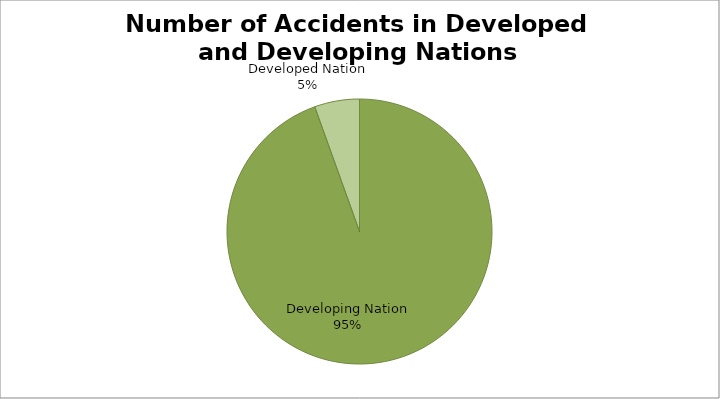
| Category | Number of Accidents |
|---|---|
| Developing Nation | 224 |
| Developed Nation | 13 |